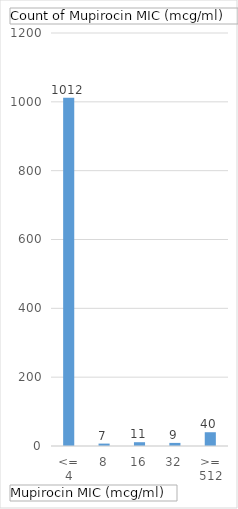
| Category | Total |
|---|---|
| <= 4 | 1012 |
| 8 | 7 |
| 16 | 11 |
| 32 | 9 |
| >= 512 | 40 |